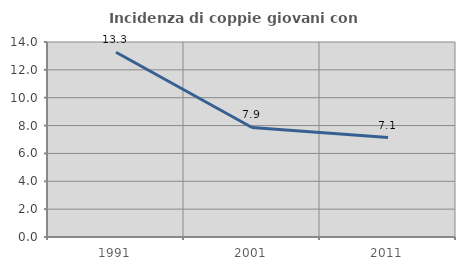
| Category | Incidenza di coppie giovani con figli |
|---|---|
| 1991.0 | 13.265 |
| 2001.0 | 7.865 |
| 2011.0 | 7.143 |